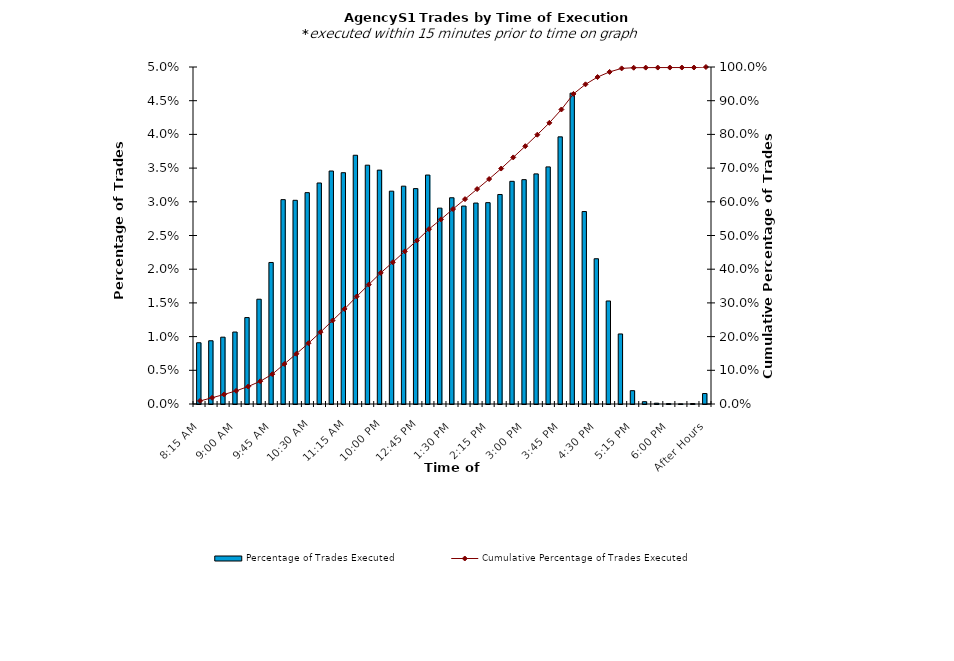
| Category | Percentage of Trades Executed |
|---|---|
| 8:15 AM | 0.009 |
| 8:30 AM | 0.009 |
| 8:45 AM | 0.01 |
| 9:00 AM | 0.011 |
| 9:15 AM | 0.013 |
| 9:30 AM | 0.016 |
| 9:45 AM | 0.021 |
| 10:00 AM | 0.03 |
| 10:15 AM | 0.03 |
| 10:30 AM | 0.031 |
| 10:45 AM | 0.033 |
| 11:00 AM | 0.035 |
| 11:15 AM | 0.034 |
| 11:30 AM | 0.037 |
| 11:45 AM | 0.035 |
| 12:00 PM | 0.035 |
| 12:15 PM | 0.032 |
| 12:30 PM | 0.032 |
| 12:45 PM | 0.032 |
| 1:00 PM | 0.034 |
| 1:15 PM | 0.029 |
| 1:30 PM | 0.031 |
| 1:45 PM | 0.029 |
| 2:00 PM | 0.03 |
| 2:15 PM | 0.03 |
| 2:30 PM | 0.031 |
| 2:45 PM | 0.033 |
| 3:00 PM | 0.033 |
| 3:15 PM | 0.034 |
| 3:30 PM | 0.035 |
| 3:45 PM | 0.04 |
| 4:00 PM | 0.046 |
| 4:15 PM | 0.029 |
| 4:30 PM | 0.022 |
| 4:45 PM | 0.015 |
| 5:00 PM | 0.01 |
| 5:15 PM | 0.002 |
| 5:30 PM | 0 |
| 5:45 PM | 0 |
| 6:00 PM | 0 |
| 6:15 PM | 0 |
| 6:30 PM | 0 |
| After Hours | 0.002 |